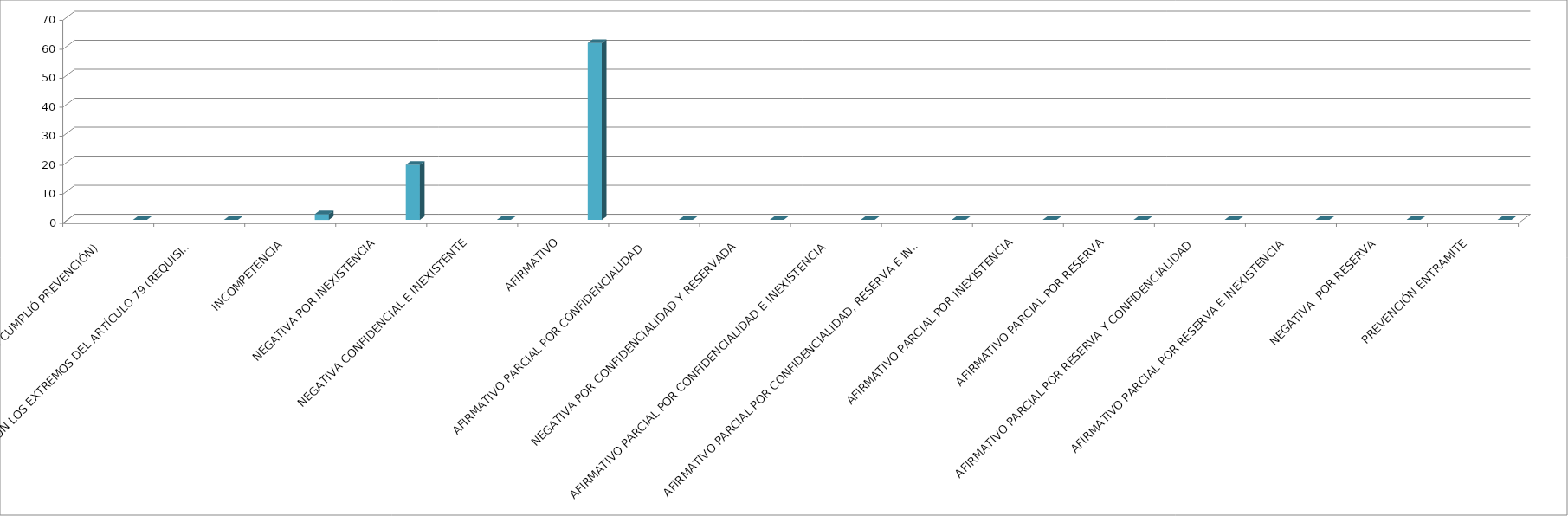
| Category | Series 0 | Series 1 | Series 2 | Series 3 | Series 4 |
|---|---|---|---|---|---|
| SE TIENE POR NO PRESENTADA ( NO CUMPLIÓ PREVENCIÓN) |  |  |  |  | 0 |
| NO CUMPLIO CON LOS EXTREMOS DEL ARTÍCULO 79 (REQUISITOS) |  |  |  |  | 0 |
| INCOMPETENCIA  |  |  |  |  | 2 |
| NEGATIVA POR INEXISTENCIA |  |  |  |  | 19 |
| NEGATIVA CONFIDENCIAL E INEXISTENTE |  |  |  |  | 0 |
| AFIRMATIVO |  |  |  |  | 61 |
| AFIRMATIVO PARCIAL POR CONFIDENCIALIDAD  |  |  |  |  | 0 |
| NEGATIVA POR CONFIDENCIALIDAD Y RESERVADA |  |  |  |  | 0 |
| AFIRMATIVO PARCIAL POR CONFIDENCIALIDAD E INEXISTENCIA |  |  |  |  | 0 |
| AFIRMATIVO PARCIAL POR CONFIDENCIALIDAD, RESERVA E INEXISTENCIA |  |  |  |  | 0 |
| AFIRMATIVO PARCIAL POR INEXISTENCIA |  |  |  |  | 0 |
| AFIRMATIVO PARCIAL POR RESERVA |  |  |  |  | 0 |
| AFIRMATIVO PARCIAL POR RESERVA Y CONFIDENCIALIDAD |  |  |  |  | 0 |
| AFIRMATIVO PARCIAL POR RESERVA E INEXISTENCIA |  |  |  |  | 0 |
| NEGATIVA  POR RESERVA |  |  |  |  | 0 |
| PREVENCIÓN ENTRAMITE |  |  |  |  | 0 |